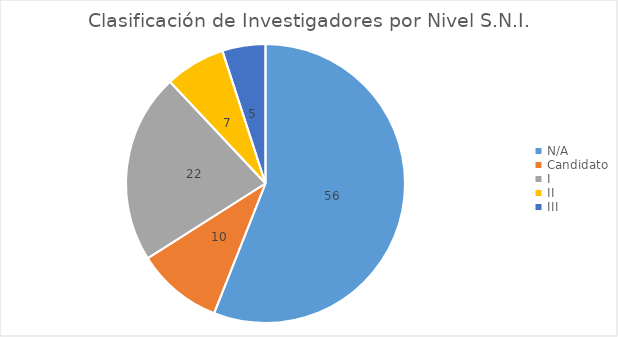
| Category | Series 0 |
|---|---|
| N/A | 56 |
| Candidato | 10 |
| I | 22 |
| II | 7 |
| III | 5 |